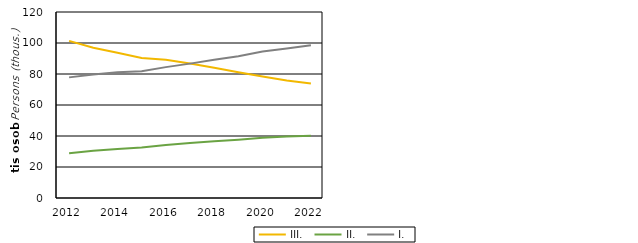
| Category | III. | II. | I. |
|---|---|---|---|
| 2012.0 | 101387 | 28878 | 77819 |
| 2013.0 | 96952 | 30526 | 79626 |
| 2014.0 | 93755 | 31671 | 81115 |
| 2015.0 | 90338 | 32507 | 81832 |
| 2016.0 | 89249 | 34143 | 84438 |
| 2017.0 | 86806 | 35549 | 86699 |
| 2018.0 | 83987 | 36613 | 89203 |
| 2019.0 | 81104 | 37596 | 91452 |
| 2020.0 | 78349 | 38921 | 94502 |
| 2021.0 | 75835 | 39610 | 96467 |
| 2022.0 | 73820 | 40146 | 98567 |